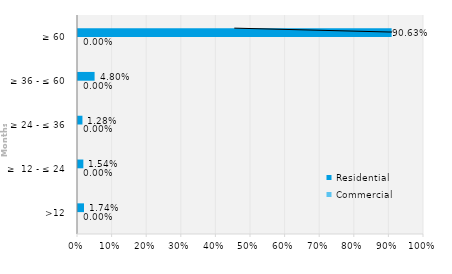
| Category | Commercial | Residential |
|---|---|---|
| >12 | 0 | 0.017 |
| ≥  12 - ≤ 24 | 0 | 0.015 |
| ≥ 24 - ≤ 36 | 0 | 0.013 |
| ≥ 36 - ≤ 60 | 0 | 0.048 |
| ≥ 60 | 0 | 0.906 |